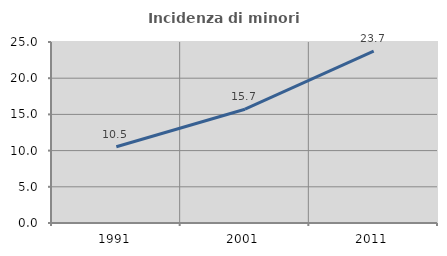
| Category | Incidenza di minori stranieri |
|---|---|
| 1991.0 | 10.526 |
| 2001.0 | 15.714 |
| 2011.0 | 23.743 |